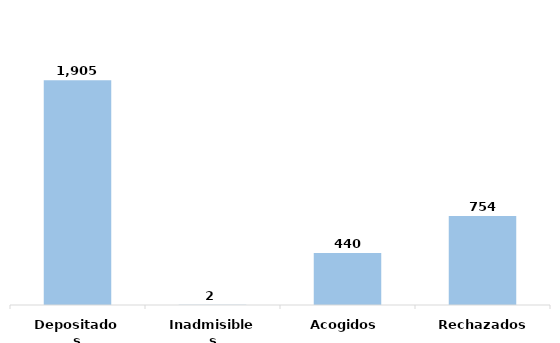
| Category | Series 0 |
|---|---|
| Depositados | 1905 |
| Inadmisibles | 2 |
| Acogidos | 440 |
| Rechazados | 754 |